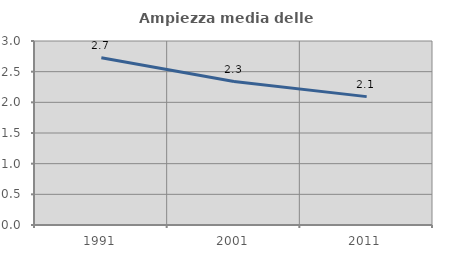
| Category | Ampiezza media delle famiglie |
|---|---|
| 1991.0 | 2.725 |
| 2001.0 | 2.338 |
| 2011.0 | 2.093 |